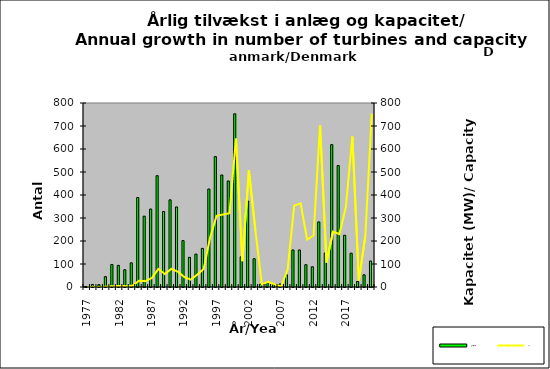
| Category | Antal/No |
|---|---|
| 1977.0 | 2 |
| 1978.0 | 11 |
| 1979.0 | 10 |
| 1980.0 | 45 |
| 1981.0 | 98 |
| 1982.0 | 94 |
| 1983.0 | 75 |
| 1984.0 | 105 |
| 1985.0 | 389 |
| 1986.0 | 308 |
| 1987.0 | 339 |
| 1988.0 | 484 |
| 1989.0 | 328 |
| 1990.0 | 379 |
| 1991.0 | 348 |
| 1992.0 | 202 |
| 1993.0 | 129 |
| 1994.0 | 143 |
| 1995.0 | 168 |
| 1996.0 | 426 |
| 1997.0 | 567 |
| 1998.0 | 487 |
| 1999.0 | 461 |
| 2000.0 | 753 |
| 2001.0 | 131 |
| 2002.0 | 374 |
| 2003.0 | 123 |
| 2004.0 | 12 |
| 2005.0 | 18 |
| 2006.0 | 10 |
| 2007.0 | 13 |
| 2008.0 | 53 |
| 2009.0 | 161 |
| 2010.0 | 161 |
| 2011.0 | 97 |
| 2012.0 | 88 |
| 2013.0 | 283 |
| 2014.0 | 148 |
| 2015.0 | 619 |
| 2016.0 | 528 |
| 2017.0 | 225 |
| 2018.0 | 147 |
| 2019.0 | 24 |
| 2020.0 | 53 |
| 2021.0 | 113 |